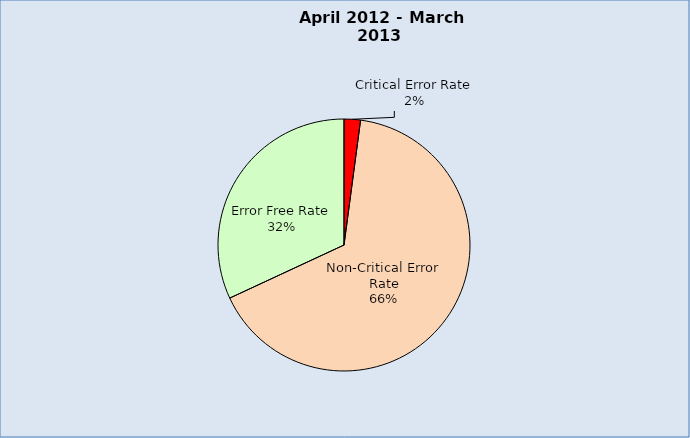
| Category | Series 0 |
|---|---|
| Critical Error Rate | 0.021 |
| Non-Critical Error Rate | 0.66 |
| Error Free Rate | 0.319 |